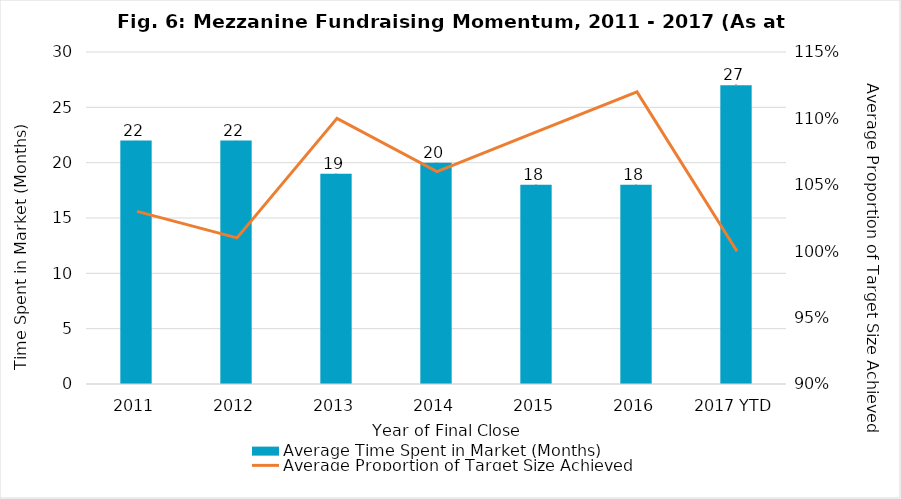
| Category | Average Time Spent in Market (Months) |
|---|---|
| 2011 | 22 |
| 2012 | 22 |
| 2013 | 19 |
| 2014 | 20 |
| 2015 | 18 |
| 2016 | 18 |
| 2017 YTD | 27 |